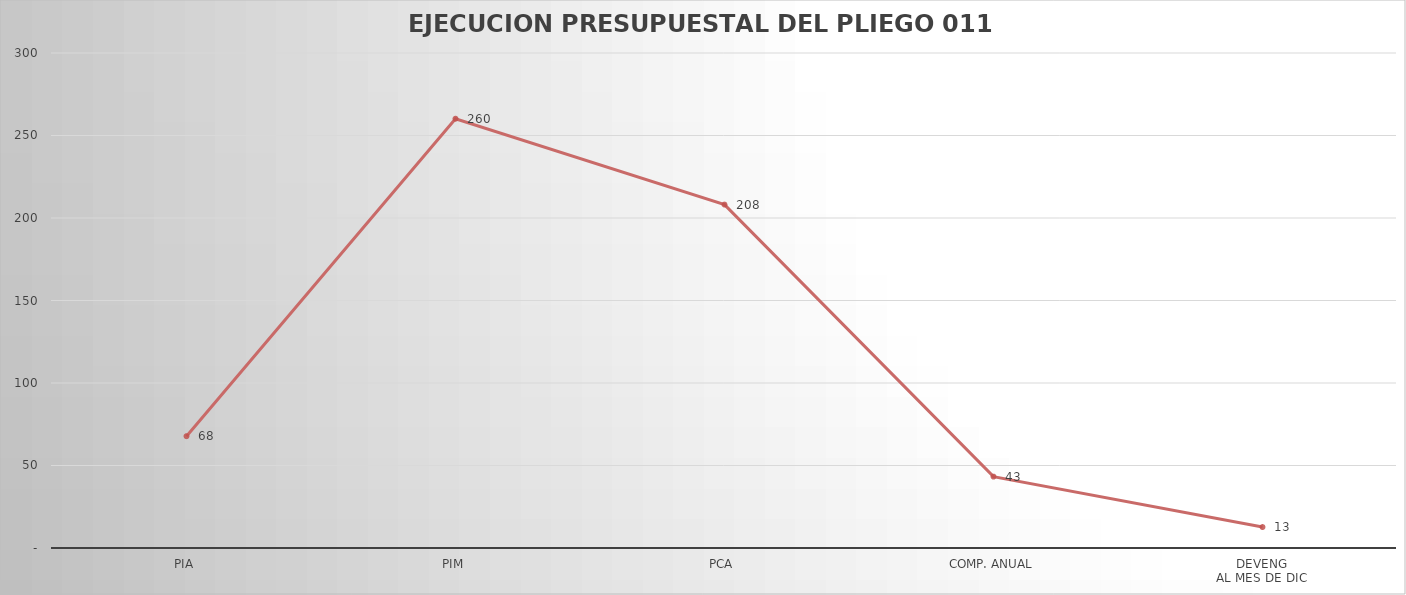
| Category | Series 0 |
|---|---|
| PIA | 67.768 |
| PIM | 260.17 |
| PCA | 208.136 |
| COMP. ANUAL | 43.267 |
| DEVENG
AL MES DE DIC | 12.711 |